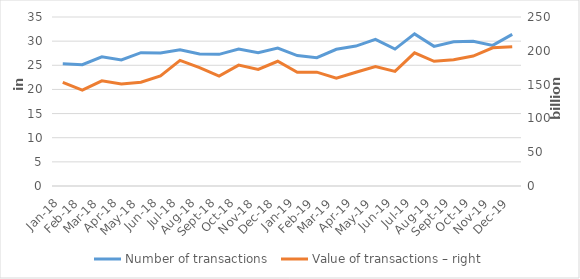
| Category | Number of transactions  |
|---|---|
| sij.18 | 25297903 |
| Feb-18 | 25137052 |
| ožu.18 | 26744162 |
| tra.18 | 26111580 |
| svi.18 | 27608631 |
| lip.18 | 27540225 |
| srp.18 | 28231809 |
| kol.18 | 27356459 |
| ruj.18 | 27269442 |
| lis.18 | 28386045 |
| stu.18 | 27579621 |
| pro.18 | 28580581 |
| sij.19 | 27005568 |
| Feb-19 | 26571736 |
| ožu.19 | 28315672 |
| tra.19 | 28974478 |
| svi.19 | 30360495 |
| lip.19 | 28359379 |
| srp.19 | 31493402 |
| kol.19 | 28920043 |
| ruj.19 | 29864803 |
| lis.19 | 29976491 |
| stu.19 | 29117460 |
| pro.19 | 31391661 |